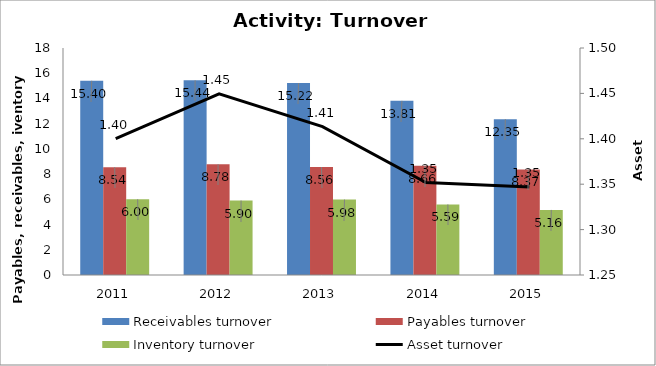
| Category | Receivables turnover | Payables turnover | Inventory turnover |
|---|---|---|---|
| 2011.0 | 15.403 | 8.545 | 6.002 |
| 2012.0 | 15.436 | 8.781 | 5.903 |
| 2013.0 | 15.216 | 8.556 | 5.98 |
| 2014.0 | 13.81 | 8.66 | 5.595 |
| 2015.0 | 12.352 | 8.374 | 5.16 |